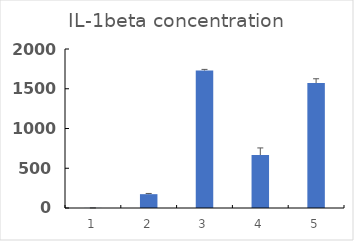
| Category | Series 0 |
|---|---|
| 0 | 1 |
| 1 | 174 |
| 2 | 1730 |
| 3 | 666.667 |
| 4 | 1571 |